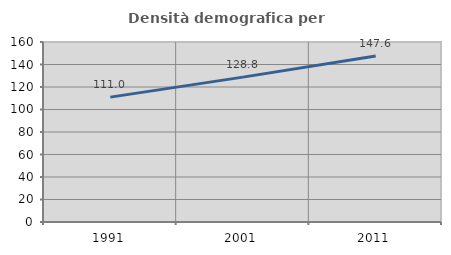
| Category | Densità demografica |
|---|---|
| 1991.0 | 110.996 |
| 2001.0 | 128.772 |
| 2011.0 | 147.569 |